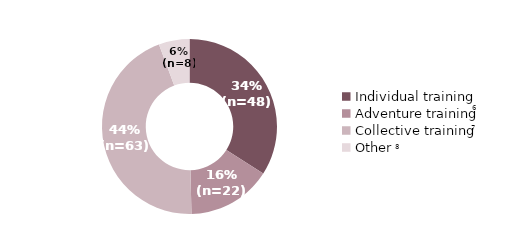
| Category | Series 0 |
|---|---|
| Individual training | 48 |
| Adventure training | 22 |
| Collective training | 63 |
| Other | 8 |